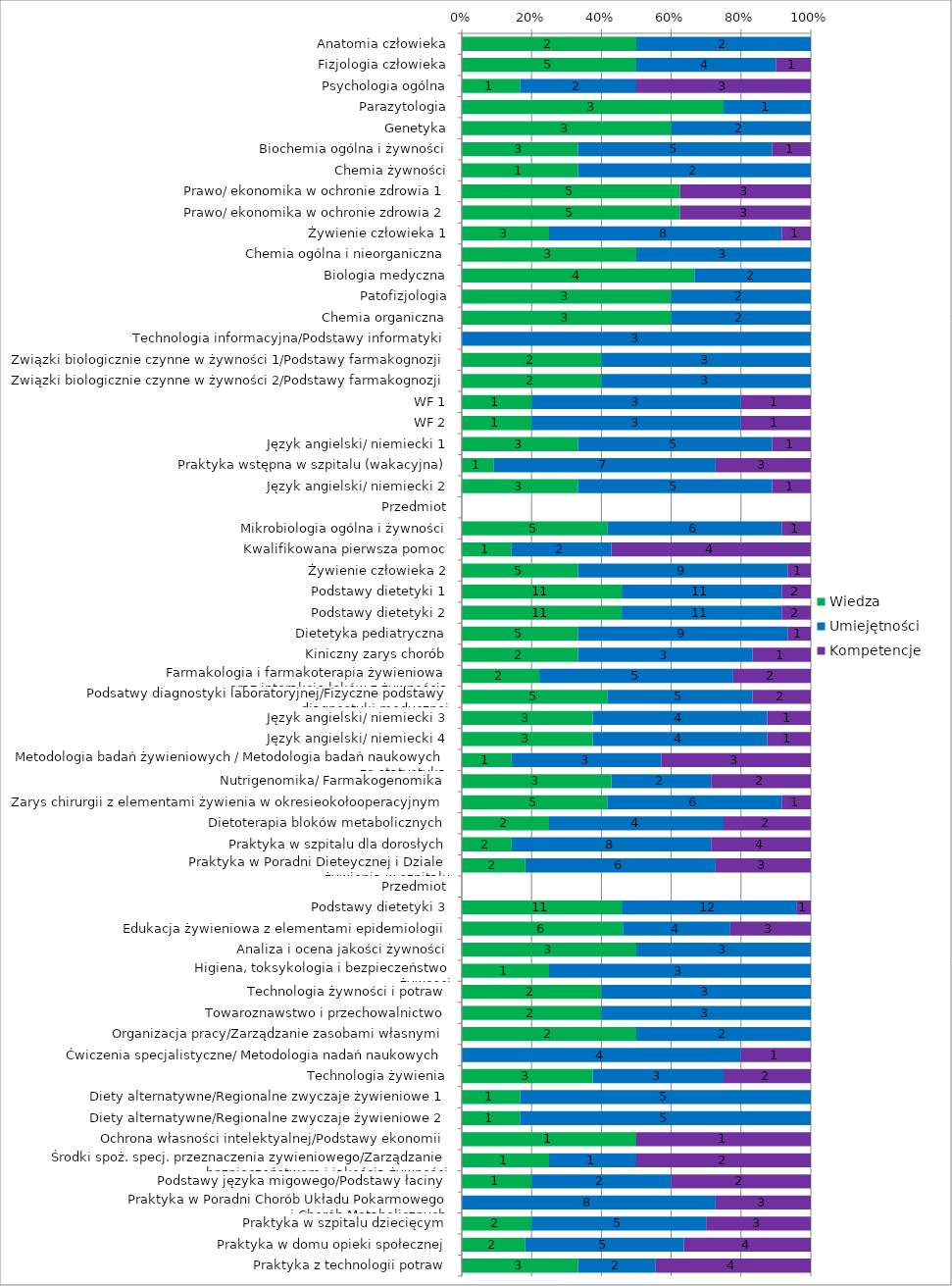
| Category | Wiedza | Umiejętności | Kompetencje |
|---|---|---|---|
| Anatomia człowieka | 2 | 2 | 0 |
| Fizjologia człowieka | 5 | 4 | 1 |
| Psychologia ogólna | 1 | 2 | 3 |
| Parazytologia | 3 | 1 | 0 |
| Genetyka | 3 | 2 | 0 |
| Biochemia ogólna i żywności | 3 | 5 | 1 |
| Chemia żywności | 1 | 2 | 0 |
| Prawo/ ekonomika w ochronie zdrowia 1 | 5 | 0 | 3 |
| Prawo/ ekonomika w ochronie zdrowia 2 | 5 | 0 | 3 |
| Żywienie człowieka 1 | 3 | 8 | 1 |
| Chemia ogólna i nieorganiczna | 3 | 3 | 0 |
| Biologia medyczna | 4 | 2 | 0 |
| Patofizjologia | 3 | 2 | 0 |
| Chemia organiczna | 3 | 2 | 0 |
| Technologia informacyjna/Podstawy informatyki | 0 | 3 | 0 |
| Związki biologicznie czynne w żywności 1/Podstawy farmakognozji | 2 | 3 | 0 |
| Związki biologicznie czynne w żywności 2/Podstawy farmakognozji | 2 | 3 | 0 |
| WF 1 | 1 | 3 | 1 |
| WF 2 | 1 | 3 | 1 |
| Język angielski/ niemiecki 1 | 3 | 5 | 1 |
| Praktyka wstępna w szpitalu (wakacyjna) | 1 | 7 | 3 |
| Język angielski/ niemiecki 2 | 3 | 5 | 1 |
| Przedmiot | 0 | 0 | 0 |
| Mikrobiologia ogólna i żywności | 5 | 6 | 1 |
| Kwalifikowana pierwsza pomoc | 1 | 2 | 4 |
| Żywienie człowieka 2 | 5 | 9 | 1 |
| Podstawy dietetyki 1 | 11 | 11 | 2 |
| Podstawy dietetyki 2 | 11 | 11 | 2 |
| Dietetyka pediatryczna | 5 | 9 | 1 |
| Kiniczny zarys chorób | 2 | 3 | 1 |
| Farmakologia i farmakoterapia żywieniowa 
oraz interakcje leków z żywnością | 2 | 5 | 2 |
| Podsatwy diagnostyki laboratoryjnej/Fizyczne podstawy diagnostyki medycznej | 5 | 5 | 2 |
| Język angielski/ niemiecki 3 | 3 | 4 | 1 |
| Język angielski/ niemiecki 4 | 3 | 4 | 1 |
| Metodologia badań żywieniowych / Metodologia badań naukowych ze statystyką  | 1 | 3 | 3 |
| Nutrigenomika/ Farmakogenomika | 3 | 2 | 2 |
| Zarys chirurgii z elementami żywienia w okresieokołooperacyjnym | 5 | 6 | 1 |
| Dietoterapia bloków metabolicznych | 2 | 4 | 2 |
| Praktyka w szpitalu dla dorosłych | 2 | 8 | 4 |
| Praktyka w Poradni Dieteycznej i Dziale 
żywienia w szpitalu | 2 | 6 | 3 |
| Przedmiot | 0 | 0 | 0 |
| Podstawy dietetyki 3 | 11 | 12 | 1 |
| Edukacja żywieniowa z elementami epidemiologii | 6 | 4 | 3 |
| Analiza i ocena jakości żywności | 3 | 3 | 0 |
| Higiena, toksykologia i bezpieczeństwo
żywosci | 1 | 3 | 0 |
| Technologia żywności i potraw | 2 | 3 | 0 |
| Towaroznawstwo i przechowalnictwo | 2 | 3 | 0 |
| Organizacja pracy/Zarządzanie zasobami własnymi | 2 | 2 | 0 |
| Ćwiczenia specjalistyczne/ Metodologia nadań naukowych | 0 | 4 | 1 |
| Technologia żywienia | 3 | 3 | 2 |
| Diety alternatywne/Regionalne zwyczaje żywieniowe 1 | 1 | 5 | 0 |
| Diety alternatywne/Regionalne zwyczaje żywieniowe 2 | 1 | 5 | 0 |
| Ochrona własności intelektyalnej/Podstawy ekonomii | 1 | 0 | 1 |
| Środki spoż. specj. przeznaczenia zywieniowego/Zarządzanie bezpieczeństwem i jakością żywności | 1 | 1 | 2 |
| Podstawy języka migowego/Podstawy łaciny | 1 | 2 | 2 |
| Praktyka w Poradni Chorób Układu Pokarmowego
i Chorób Metabolicznych | 0 | 8 | 3 |
| Praktyka w szpitalu dziecięcym | 2 | 5 | 3 |
| Praktyka w domu opieki społecznej | 2 | 5 | 4 |
| Praktyka z technologii potraw | 3 | 2 | 4 |